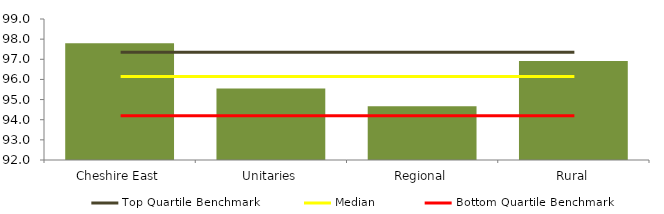
| Category | Block Data |
|---|---|
| Cheshire East | 97.8 |
| Unitaries | 95.545 |
| Regional | 94.665 |
|  Rural  | 96.91 |